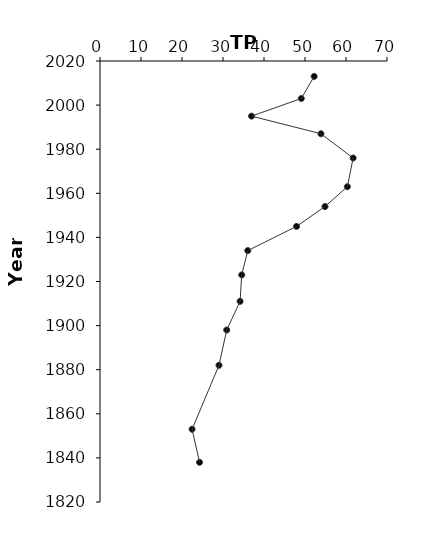
| Category | Series 0 |
|---|---|
| 52.232402228368926 | 2013 |
| 49.09417880385948 | 2003 |
| 36.972600659421595 | 1995 |
| 53.8927071850771 | 1987 |
| 61.740479776509964 | 1976 |
| 60.33648416017017 | 1963 |
| 54.87442720707827 | 1954 |
| 47.93580224027785 | 1945 |
| 36.047072498325306 | 1934 |
| 34.5612944446367 | 1923 |
| 34.17275555584272 | 1911 |
| 30.905089099326315 | 1898 |
| 29.02217790558753 | 1882 |
| 22.457944281075296 | 1853 |
| 24.28231004310113 | 1838 |